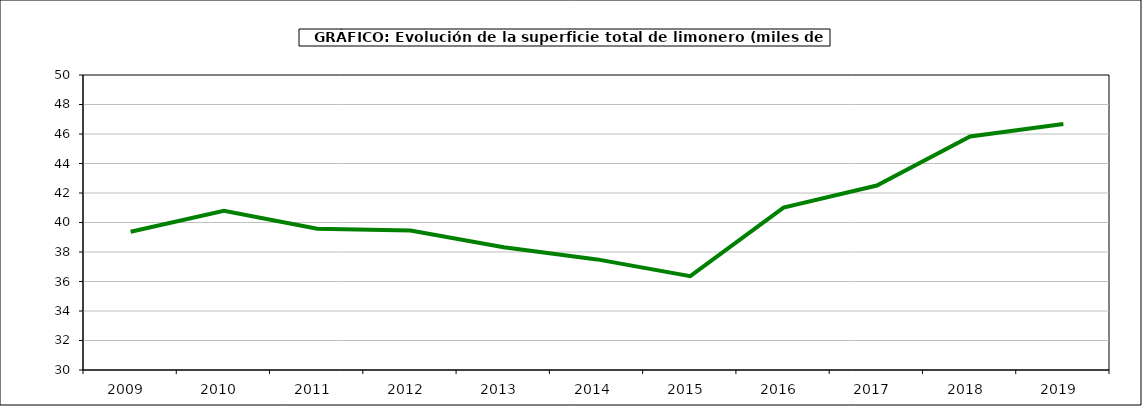
| Category | superficie |
|---|---|
| 2009.0 | 39.371 |
| 2010.0 | 40.801 |
| 2011.0 | 39.571 |
| 2012.0 | 39.463 |
| 2013.0 | 38.319 |
| 2014.0 | 37.498 |
| 2015.0 | 36.363 |
| 2016.0 | 41.009 |
| 2017.0 | 42.507 |
| 2018.0 | 45.832 |
| 2019.0 | 46.684 |